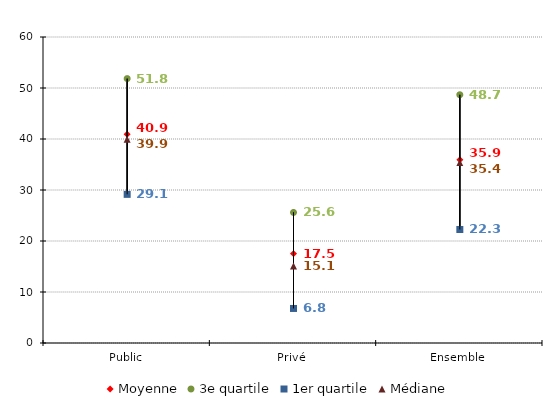
| Category | Moyenne | 3e quartile | 1er quartile | Médiane |
|---|---|---|---|---|
| Public | 40.935 | 51.842 | 29.144 | 39.946 |
| Privé | 17.542 | 25.601 | 6.771 | 15.101 |
| Ensemble | 35.939 | 48.677 | 22.258 | 35.376 |